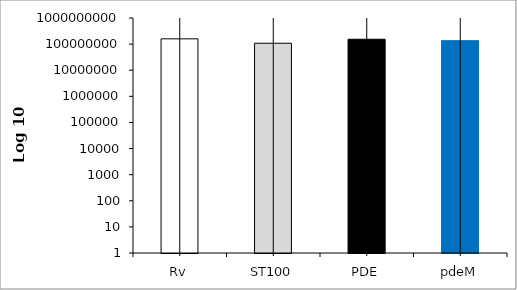
| Category | Series 0 |
|---|---|
| Rv | 159333333.333 |
| ST100 | 108000000 |
| PDE | 153333333.333 |
| pdeM | 135333333.333 |